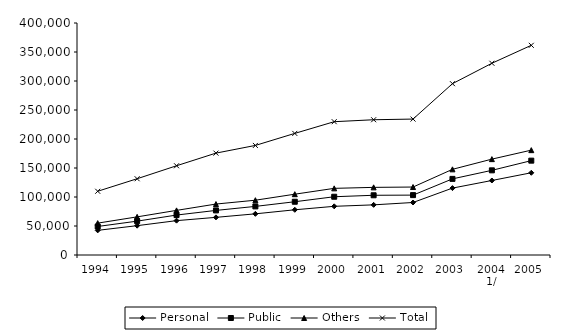
| Category | Personal | Public | Others | Total |
|---|---|---|---|---|
| 1994 | 42500.67 | 6667.018 | 5779.409 | 54947.097 |
| 1995 | 50584.213 | 7773.658 | 7383.938 | 65741.809 |
| 1996 | 59221.573 | 9648.612 | 8056.667 | 76926.852 |
| 1997 | 64905.394 | 11975.465 | 10949.688 | 87830.546 |
| 1998 | 70965.372 | 12824.416 | 10664.399 | 94454.188 |
| 1999 | 77946.996 | 13873.802 | 13006.208 | 104827.006 |
| 2000 | 83919.433 | 16529.689 | 14462.341 | 114911.464 |
| 2001 | 86473.752 | 16490.118 | 13637.895 | 116601.765 |
| 2002 | 90541.852 | 12709.932 | 13928.013 | 117179.796 |
| 2003 | 115347.039 | 15900.325 | 16435.911 | 147683.274 |
| 2004 1/ | 128460.944 | 17503.962 | 19330.009 | 165294.915 |
| 2005 | 141764.13 | 20903.064 | 18104.734 | 180771.928 |